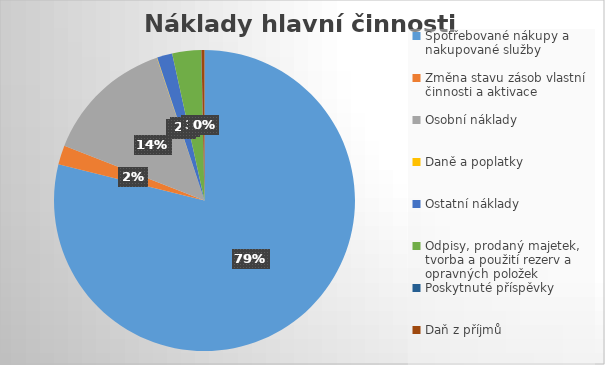
| Category | Series 0 |
|---|---|
| Spotřebované nákupy a nakupované služby | 37918 |
| Změna stavu zásob vlastní činnosti a aktivace | -993 |
| Osobní náklady | 6702 |
| Daně a poplatky | 19 |
| Ostatní náklady | 787 |
| Odpisy, prodaný majetek, tvorba a použití rezerv a opravných položek | 1488 |
| Poskytnuté příspěvky | 15 |
| Daň z příjmů | 156 |